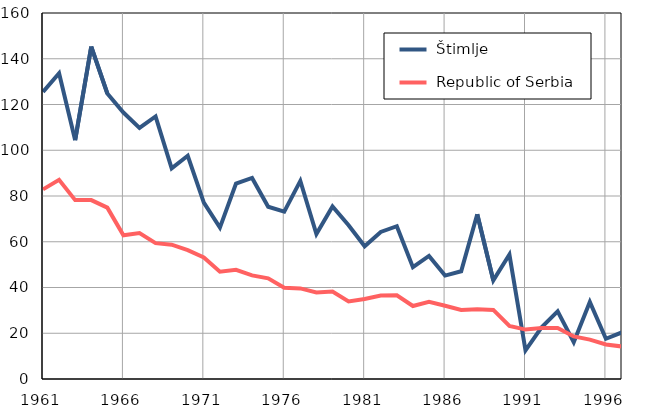
| Category |  Štimlje |  Republic of Serbia |
|---|---|---|
| 1961.0 | 125.5 | 82.9 |
| 1962.0 | 133.7 | 87.1 |
| 1963.0 | 104.4 | 78.2 |
| 1964.0 | 145.3 | 78.2 |
| 1965.0 | 124.8 | 74.9 |
| 1966.0 | 116.5 | 62.8 |
| 1967.0 | 109.8 | 63.8 |
| 1968.0 | 114.8 | 59.4 |
| 1969.0 | 92.1 | 58.7 |
| 1970.0 | 97.6 | 56.3 |
| 1971.0 | 77.1 | 53.1 |
| 1972.0 | 66.2 | 46.9 |
| 1973.0 | 85.4 | 47.7 |
| 1974.0 | 87.9 | 45.3 |
| 1975.0 | 75.3 | 44 |
| 1976.0 | 73.2 | 39.9 |
| 1977.0 | 86.6 | 39.6 |
| 1978.0 | 63.4 | 37.8 |
| 1979.0 | 75.4 | 38.2 |
| 1980.0 | 67.2 | 33.9 |
| 1981.0 | 58 | 35 |
| 1982.0 | 64.3 | 36.5 |
| 1983.0 | 66.8 | 36.6 |
| 1984.0 | 48.9 | 31.9 |
| 1985.0 | 53.8 | 33.7 |
| 1986.0 | 45.2 | 32 |
| 1987.0 | 47.1 | 30.2 |
| 1988.0 | 72 | 30.5 |
| 1989.0 | 43.1 | 30.2 |
| 1990.0 | 54.4 | 23.2 |
| 1991.0 | 12.5 | 21.6 |
| 1992.0 | 22.6 | 22.3 |
| 1993.0 | 29.6 | 22.3 |
| 1994.0 | 16.1 | 18.6 |
| 1995.0 | 33.7 | 17.2 |
| 1996.0 | 17.6 | 15.1 |
| 1997.0 | 20.4 | 14.2 |